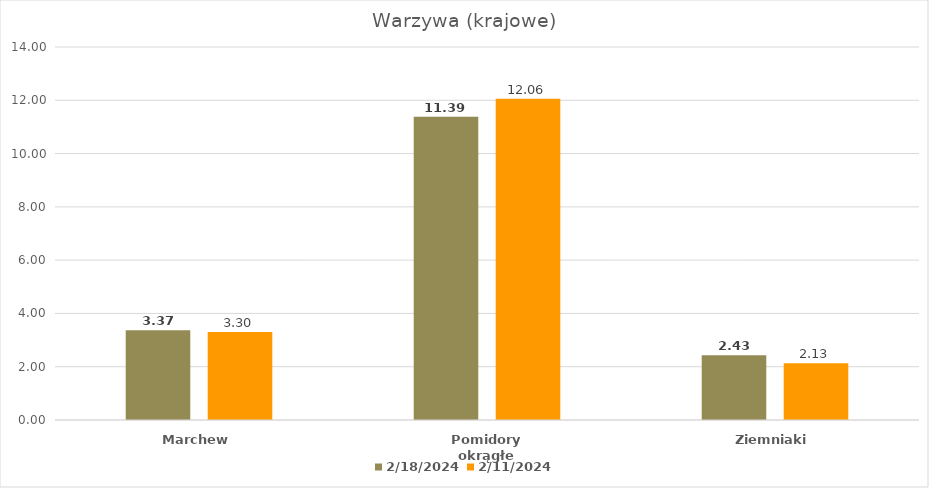
| Category | 18.02.2024 | 11.02.2024 |
|---|---|---|
| Marchew | 3.372 | 3.3 |
| Pomidory okrągłe | 11.385 | 12.06 |
| Ziemniaki | 2.432 | 2.13 |